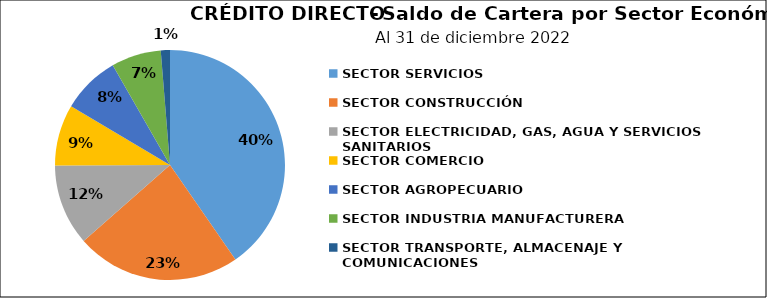
| Category | Saldo | Créditos |
|---|---|---|
| SECTOR SERVICIOS | 73.566 | 43 |
| SECTOR CONSTRUCCIÓN | 42.179 | 7 |
| SECTOR ELECTRICIDAD, GAS, AGUA Y SERVICIOS SANITARIOS | 20.762 | 2 |
| SECTOR COMERCIO | 15.68 | 19 |
| SECTOR AGROPECUARIO | 14.92 | 9 |
| SECTOR INDUSTRIA MANUFACTURERA | 12.759 | 11 |
| SECTOR TRANSPORTE, ALMACENAJE Y COMUNICACIONES | 2.344 | 2 |